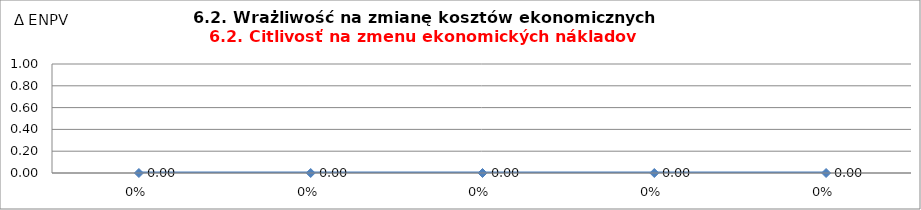
| Category | 6.2. Wrażliwość na zmianę kosztów ekonomicznych
6.2. Citlivosť na zmenu ekonomických nákladov |
|---|---|
| 0.0 | 0 |
| 0.0 | 0 |
| 0.0 | 0 |
| 0.0 | 0 |
| 0.0 | 0 |